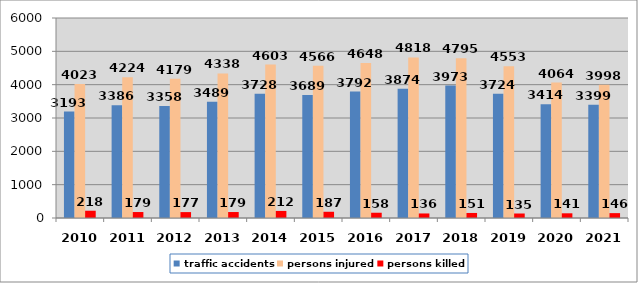
| Category | traffic accidents | persons injured | persons killed |
|---|---|---|---|
| 2010.0 | 3193 | 4023 | 218 |
| 2011.0 | 3386 | 4224 | 179 |
| 2012.0 | 3358 | 4179 | 177 |
| 2013.0 | 3489 | 4338 | 179 |
| 2014.0 | 3728 | 4603 | 212 |
| 2015.0 | 3689 | 4566 | 187 |
| 2016.0 | 3792 | 4648 | 158 |
| 2017.0 | 3874 | 4818 | 136 |
| 2018.0 | 3973 | 4795 | 151 |
| 2019.0 | 3724 | 4553 | 135 |
| 2020.0 | 3414 | 4064 | 141 |
| 2021.0 | 3399 | 3998 | 146 |